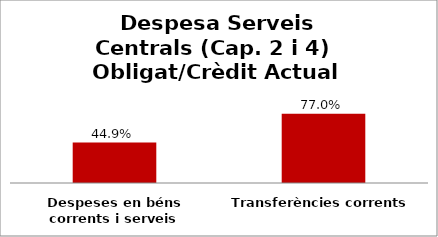
| Category | Series 0 |
|---|---|
| Despeses en béns corrents i serveis | 0.449 |
| Transferències corrents | 0.77 |